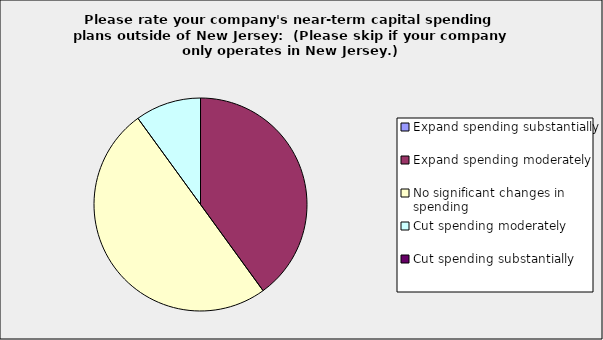
| Category | Series 0 |
|---|---|
| Expand spending substantially | 0 |
| Expand spending moderately | 0.4 |
| No significant changes in spending | 0.5 |
| Cut spending moderately | 0.1 |
| Cut spending substantially | 0 |